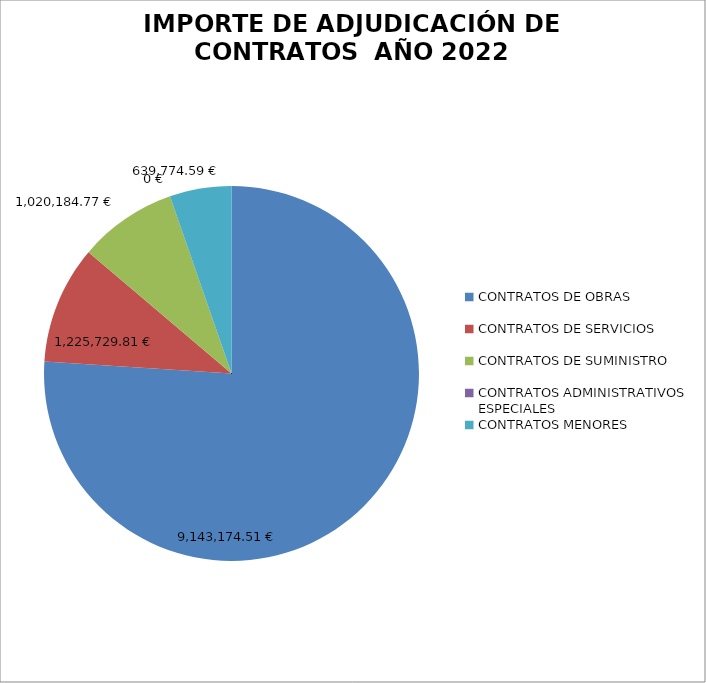
| Category | PORCENTAJE DE ADJUDICACIÓN DE CONTRATOS  |
|---|---|
| CONTRATOS DE OBRAS | 76.01 |
| CONTRATOS DE SERVICIOS | 10.19 |
| CONTRATOS DE SUMINISTRO | 8.481 |
| CONTRATOS ADMINISTRATIVOS ESPECIALES | 0 |
| CONTRATOS MENORES | 5.319 |